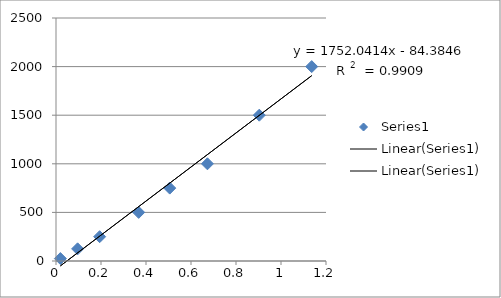
| Category | Series 0 |
|---|---|
| 0.019500000000000003 | 25 |
| 0.09599999999999999 | 125 |
| 0.194 | 250 |
| 0.3675 | 500 |
| 0.5055 | 750 |
| 0.673 | 1000 |
| 0.9035 | 1500 |
| 1.1365 | 2000 |